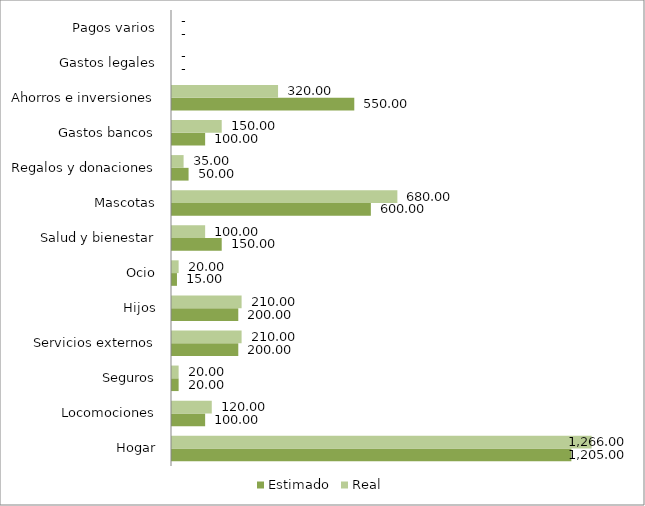
| Category | Estimado | Real |
|---|---|---|
| Hogar | 1205 | 1266 |
| Locomociones | 100 | 120 |
| Seguros | 20 | 20 |
| Servicios externos | 200 | 210 |
| Hijos | 200 | 210 |
| Ocio | 15 | 20 |
| Salud y bienestar | 150 | 100 |
| Mascotas | 600 | 680 |
| Regalos y donaciones | 50 | 35 |
| Gastos bancos | 100 | 150 |
| Ahorros e inversiones | 550 | 320 |
| Gastos legales | 0 | 0 |
| Pagos varios | 0 | 0 |